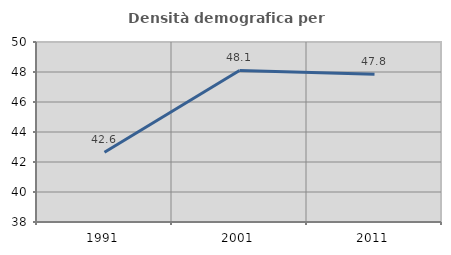
| Category | Densità demografica |
|---|---|
| 1991.0 | 42.644 |
| 2001.0 | 48.102 |
| 2011.0 | 47.846 |